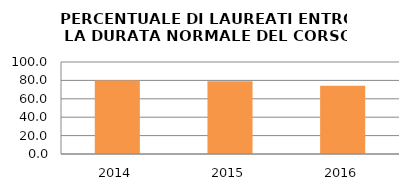
| Category | 2014 2015 2016 |
|---|---|
| 2014.0 | 80 |
| 2015.0 | 78.947 |
| 2016.0 | 74.227 |